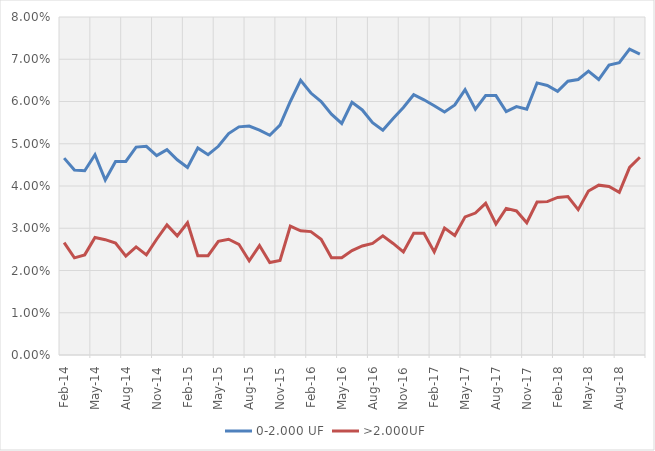
| Category | 0-2.000 UF | >2.000UF |
|---|---|---|
| 2014-02-01 | 0.047 | 0.027 |
| 2014-03-01 | 0.044 | 0.023 |
| 2014-04-01 | 0.044 | 0.024 |
| 2014-05-01 | 0.047 | 0.028 |
| 2014-06-01 | 0.041 | 0.027 |
| 2014-07-01 | 0.046 | 0.026 |
| 2014-08-01 | 0.046 | 0.023 |
| 2014-09-01 | 0.049 | 0.026 |
| 2014-10-01 | 0.049 | 0.024 |
| 2014-11-01 | 0.047 | 0.027 |
| 2014-12-01 | 0.049 | 0.031 |
| 2015-01-01 | 0.046 | 0.028 |
| 2015-02-01 | 0.044 | 0.031 |
| 2015-03-01 | 0.049 | 0.024 |
| 2015-04-01 | 0.047 | 0.024 |
| 2015-05-01 | 0.049 | 0.027 |
| 2015-06-01 | 0.052 | 0.027 |
| 2015-07-01 | 0.054 | 0.026 |
| 2015-08-01 | 0.054 | 0.022 |
| 2015-09-01 | 0.053 | 0.026 |
| 2015-10-01 | 0.052 | 0.022 |
| 2015-11-01 | 0.054 | 0.022 |
| 2015-12-01 | 0.06 | 0.03 |
| 2016-01-01 | 0.065 | 0.029 |
| 2016-02-01 | 0.062 | 0.029 |
| 2016-03-01 | 0.06 | 0.027 |
| 2016-04-01 | 0.057 | 0.023 |
| 2016-05-01 | 0.055 | 0.023 |
| 2016-06-01 | 0.06 | 0.025 |
| 2016-07-01 | 0.058 | 0.026 |
| 2016-08-01 | 0.055 | 0.026 |
| 2016-09-01 | 0.053 | 0.028 |
| 2016-10-01 | 0.056 | 0.026 |
| 2016-11-01 | 0.059 | 0.024 |
| 2016-12-01 | 0.062 | 0.029 |
| 2017-01-01 | 0.06 | 0.029 |
| 2017-02-01 | 0.059 | 0.024 |
| 2017-03-01 | 0.058 | 0.03 |
| 2017-04-01 | 0.059 | 0.028 |
| 2017-05-01 | 0.063 | 0.033 |
| 2017-06-01 | 0.058 | 0.034 |
| 2017-07-01 | 0.061 | 0.036 |
| 2017-08-01 | 0.061 | 0.031 |
| 2017-09-01 | 0.058 | 0.035 |
| 2017-10-01 | 0.059 | 0.034 |
| 2017-11-01 | 0.058 | 0.031 |
| 2017-12-01 | 0.064 | 0.036 |
| 2018-01-01 | 0.064 | 0.036 |
| 2018-02-01 | 0.062 | 0.037 |
| 2018-03-01 | 0.065 | 0.038 |
| 2018-04-01 | 0.065 | 0.034 |
| 2018-05-01 | 0.067 | 0.039 |
| 2018-06-01 | 0.065 | 0.04 |
| 2018-07-01 | 0.069 | 0.04 |
| 2018-08-01 | 0.069 | 0.038 |
| 2018-09-01 | 0.072 | 0.044 |
| 2018-10-01 | 0.071 | 0.047 |